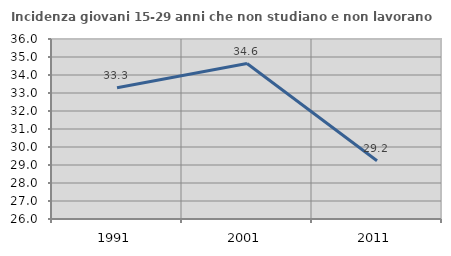
| Category | Incidenza giovani 15-29 anni che non studiano e non lavorano  |
|---|---|
| 1991.0 | 33.29 |
| 2001.0 | 34.637 |
| 2011.0 | 29.24 |